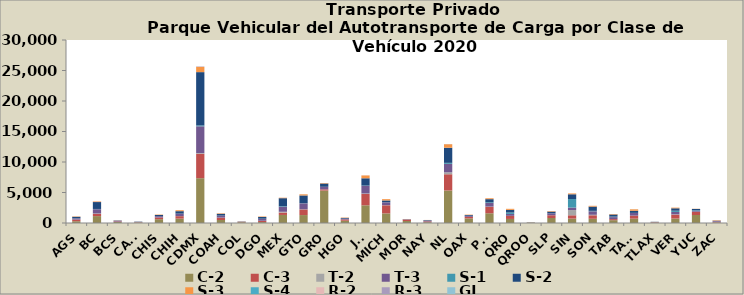
| Category | C-2 | C-3 | T-2 | T-3 | S-1 | S-2 | S-3 | S-4 | R-2 | R-3 | GI |
|---|---|---|---|---|---|---|---|---|---|---|---|
| AGS | 292 | 267 | 4 | 198 | 14 | 243 | 61 | 1 | 4 | 0 | 0 |
| BC | 1130 | 364 | 68 | 704 | 35 | 1133 | 99 | 3 | 39 | 5 | 1 |
| BCS | 160 | 90 | 2 | 94 | 1 | 62 | 27 | 0 | 1 | 7 | 1 |
| CAMP | 86 | 48 | 9 | 30 | 1 | 49 | 10 | 0 | 0 | 0 | 0 |
| CHIS | 622 | 285 | 3 | 214 | 10 | 184 | 64 | 0 | 5 | 0 | 0 |
| CHIH | 716 | 408 | 16 | 387 | 12 | 400 | 156 | 3 | 3 | 1 | 3 |
| CDMX | 7345 | 4005 | 104 | 4399 | 146 | 8734 | 851 | 7 | 81 | 13 | 21 |
| COAH | 488 | 386 | 12 | 312 | 16 | 295 | 78 | 1 | 2 | 1 | 0 |
| COL | 126 | 59 | 8 | 22 | 9 | 33 | 23 | 0 | 2 | 1 | 0 |
| DGO | 157 | 188 | 25 | 315 | 21 | 286 | 76 | 3 | 1 | 0 | 0 |
| MEX | 1321 | 387 | 131 | 814 | 86 | 1328 | 75 | 0 | 19 | 3 | 3 |
| GTO | 1302 | 923 | 32 | 972 | 28 | 1261 | 186 | 3 | 1 | 0 | 9 |
| GRO | 5314 | 205 | 0 | 420 | 0 | 539 | 84 | 0 | 4 | 1 | 2 |
| HGO | 370 | 217 | 0 | 122 | 3 | 124 | 59 | 0 | 0 | 0 | 0 |
| JAL | 2900 | 1863 | 78 | 1238 | 56 | 1197 | 464 | 4 | 7 | 12 | 1 |
| MICH | 1573 | 1332 | 28 | 468 | 22 | 274 | 213 | 0 | 7 | 4 | 1 |
| MOR | 325 | 234 | 2 | 44 | 0 | 27 | 22 | 0 | 3 | 1 | 0 |
| NAY | 130 | 133 | 0 | 114 | 4 | 91 | 27 | 0 | 0 | 0 | 0 |
| NL | 5329 | 2663 | 312 | 1391 | 165 | 2479 | 581 | 2 | 12 | 10 | 6 |
| OAX | 752 | 262 | 1 | 173 | 0 | 125 | 62 | 0 | 1 | 4 | 0 |
| PUE | 1597 | 1056 | 37 | 594 | 111 | 515 | 148 | 0 | 9 | 5 | 0 |
| QRO | 665 | 496 | 17 | 310 | 232 | 436 | 169 | 1 | 2 | 0 | 3 |
| QROO | 72 | 12 | 1 | 15 | 1 | 8 | 2 | 0 | 1 | 0 | 0 |
| SLP | 821 | 453 | 9 | 293 | 8 | 286 | 89 | 0 | 6 | 4 | 1 |
| SIN | 721 | 544 | 852 | 408 | 1403 | 781 | 140 | 1 | 1 | 0 | 1 |
| SON | 692 | 575 | 81 | 576 | 67 | 695 | 130 | 3 | 6 | 0 | 0 |
| TAB | 464 | 176 | 4 | 321 | 84 | 349 | 82 | 0 | 1 | 5 | 0 |
| TAMS | 712 | 495 | 6 | 426 | 21 | 346 | 237 | 6 | 2 | 3 | 0 |
| TLAX | 75 | 54 | 0 | 32 | 0 | 34 | 9 | 0 | 3 | 0 | 0 |
| VER | 732 | 629 | 51 | 400 | 204 | 395 | 110 | 0 | 5 | 0 | 0 |
| YUC | 1308 | 498 | 42 | 145 | 86 | 224 | 29 | 2 | 1 | 0 | 2 |
| ZAC | 105 | 87 | 6 | 110 | 2 | 68 | 71 | 0 | 0 | 1 | 0 |